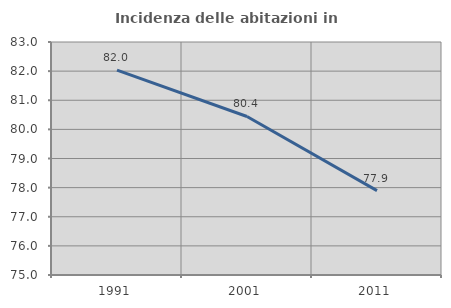
| Category | Incidenza delle abitazioni in proprietà  |
|---|---|
| 1991.0 | 82.036 |
| 2001.0 | 80.443 |
| 2011.0 | 77.897 |